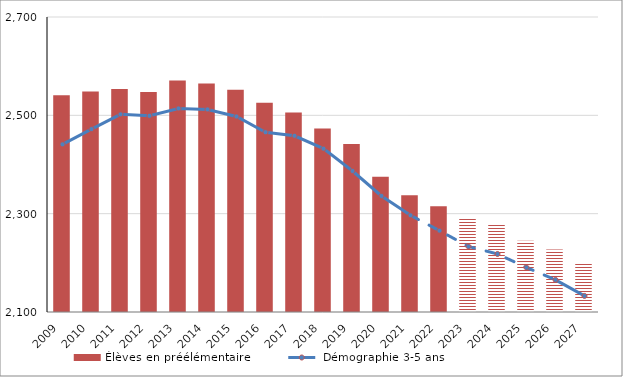
| Category | Élèves en préélémentaire |
|---|---|
| 2009.0 | 2541.04 |
| 2010.0 | 2548.715 |
| 2011.0 | 2553.567 |
| 2012.0 | 2547.414 |
| 2013.0 | 2570.9 |
| 2014.0 | 2564.606 |
| 2015.0 | 2552.014 |
| 2016.0 | 2525.465 |
| 2017.0 | 2505.653 |
| 2018.0 | 2473.058 |
| 2019.0 | 2441.82 |
| 2020.0 | 2374.98 |
| 2021.0 | 2337.371 |
| 2022.0 | 2314.893 |
| 2023.0 | 2291.261 |
| 2024.0 | 2278.478 |
| 2025.0 | 2244.892 |
| 2026.0 | 2226.893 |
| 2027.0 | 2198.284 |